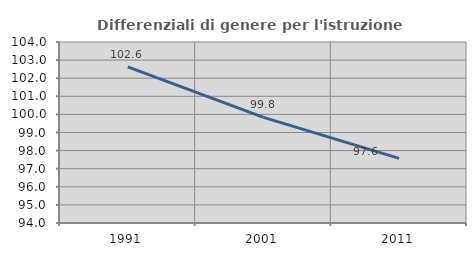
| Category | Differenziali di genere per l'istruzione superiore |
|---|---|
| 1991.0 | 102.625 |
| 2001.0 | 99.837 |
| 2011.0 | 97.568 |